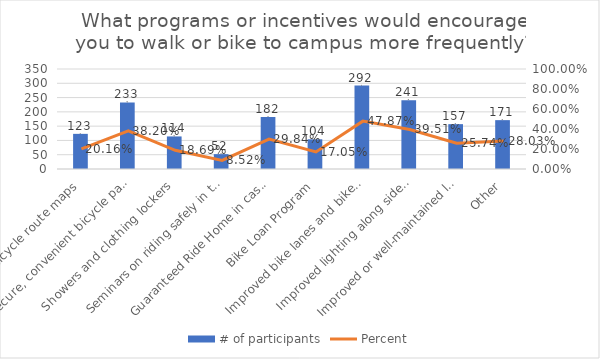
| Category | # of participants |
|---|---|
| Bicycle route maps | 123 |
| Secure, convenient bicycle parking | 233 |
| Showers and clothing lockers | 114 |
| Seminars on riding safely in traffic | 52 |
| Guaranteed Ride Home in case of emergency | 182 |
| Bike Loan Program | 104 |
| Improved bike lanes and bike paths | 292 |
| Improved lighting along sidewalks and bicycle routes | 241 |
| Improved or well-maintained landscape | 157 |
| Other | 171 |